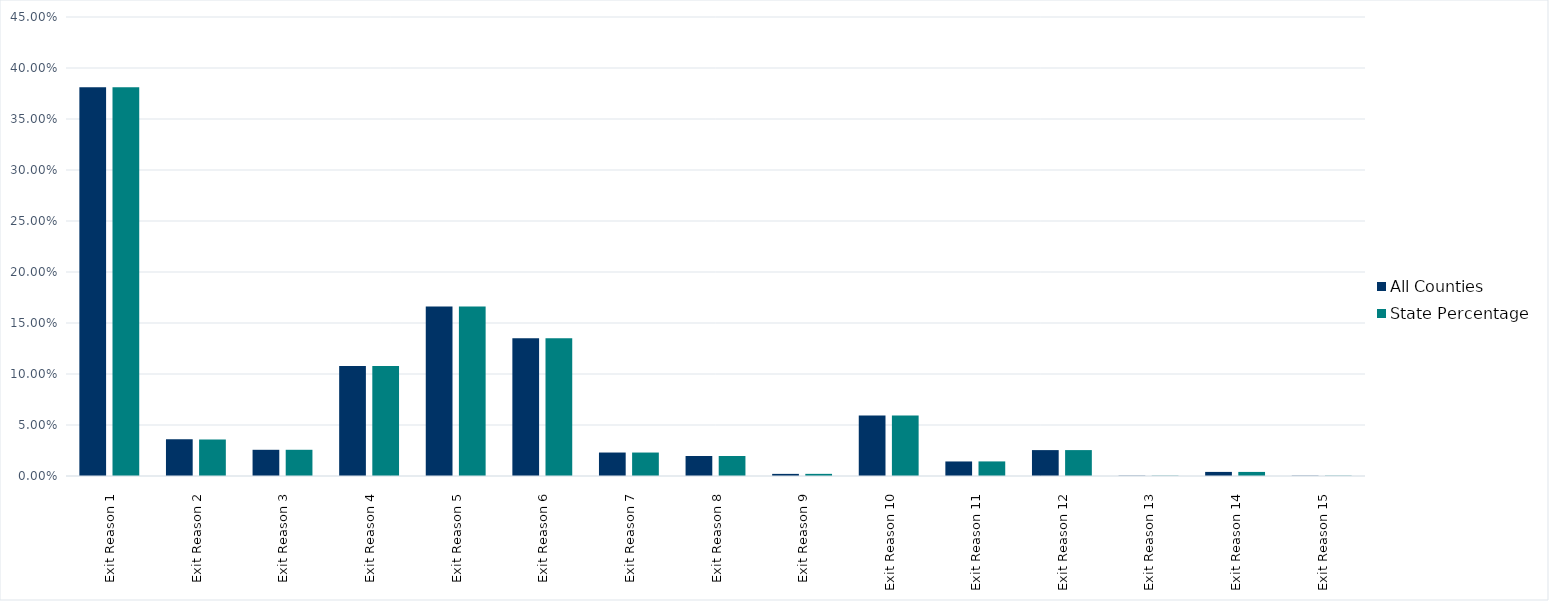
| Category | All Counties | State Percentage |
|---|---|---|
| Exit Reason 1 | 0.381 | 0.381 |
| Exit Reason 2 | 0.036 | 0.036 |
| Exit Reason 3 | 0.026 | 0.026 |
| Exit Reason 4 | 0.108 | 0.108 |
| Exit Reason 5 | 0.166 | 0.166 |
| Exit Reason 6 | 0.135 | 0.135 |
| Exit Reason 7 | 0.023 | 0.023 |
| Exit Reason 8 | 0.02 | 0.02 |
| Exit Reason 9 | 0.002 | 0.002 |
| Exit Reason 10 | 0.059 | 0.059 |
| Exit Reason 11 | 0.014 | 0.014 |
| Exit Reason 12 | 0.025 | 0.025 |
| Exit Reason 13 | 0 | 0 |
| Exit Reason 14 | 0.004 | 0.004 |
| Exit Reason 15 | 0 | 0 |